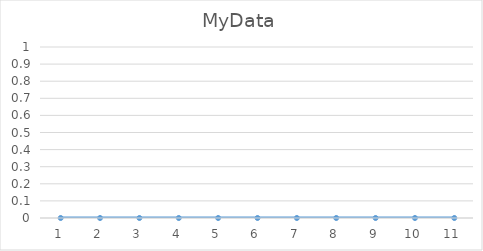
| Category | Series 0 |
|---|---|
| 0 | 1 |
| 1 | 2 |
| 2 | 3 |
| 3 | 4 |
| 4 | 5 |
| 5 | 6 |
| 6 | 7 |
| 7 | 8 |
| 8 | 9 |
| 9 | 10 |
| 10 | 11 |